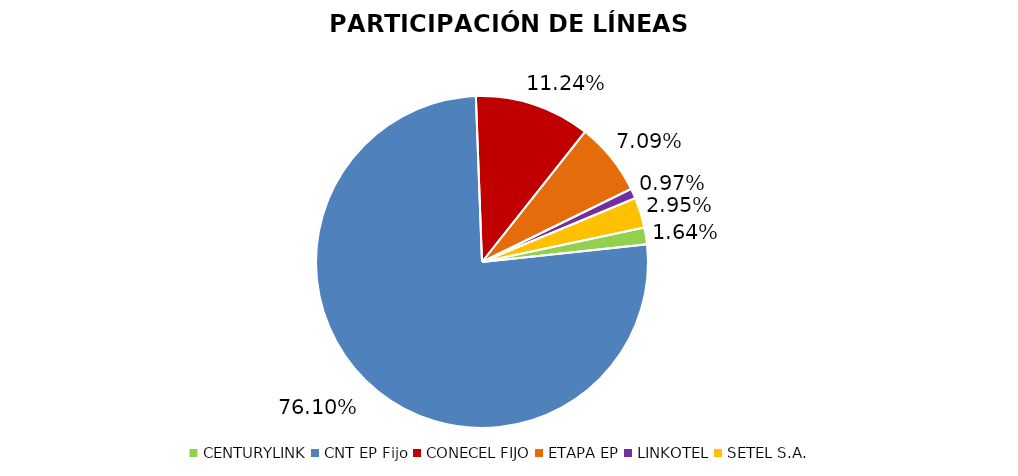
| Category | Participación en el Mercado |
|---|---|
| CENTURYLINK | 0.016 |
| CNT EP Fijo | 0.761 |
| CONECEL FIJO | 0.112 |
| ETAPA EP | 0.071 |
| LINKOTEL | 0.01 |
| SETEL S.A. | 0.03 |